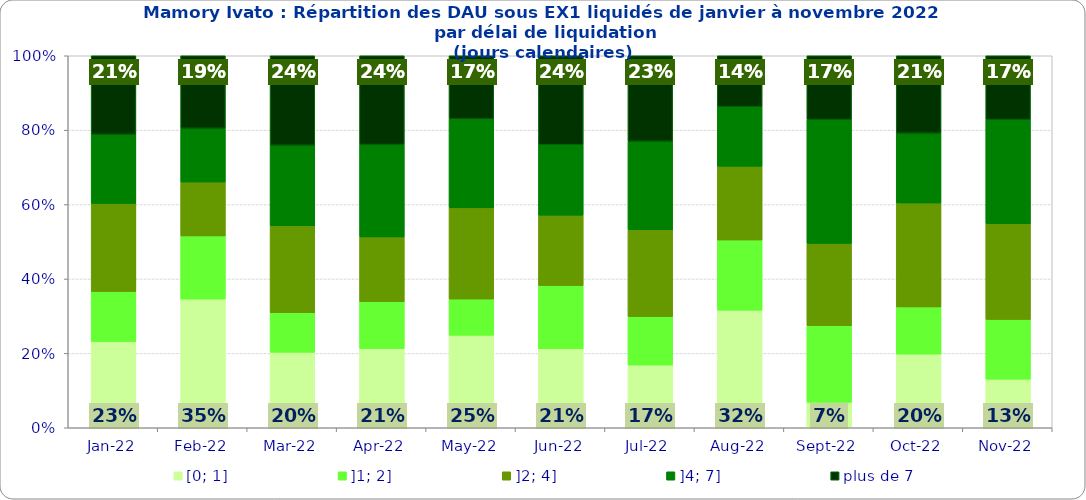
| Category | [0; 1] | ]1; 2] | ]2; 4] | ]4; 7] | plus de 7 |
|---|---|---|---|---|---|
| 2022-01-01 | 0.232 | 0.134 | 0.237 | 0.186 | 0.211 |
| 2022-02-01 | 0.346 | 0.17 | 0.145 | 0.145 | 0.195 |
| 2022-03-01 | 0.203 | 0.107 | 0.234 | 0.216 | 0.241 |
| 2022-04-01 | 0.213 | 0.126 | 0.174 | 0.248 | 0.239 |
| 2022-05-01 | 0.248 | 0.097 | 0.245 | 0.239 | 0.17 |
| 2022-06-01 | 0.213 | 0.169 | 0.189 | 0.189 | 0.239 |
| 2022-07-01 | 0.169 | 0.13 | 0.234 | 0.238 | 0.23 |
| 2022-08-01 | 0.316 | 0.189 | 0.198 | 0.16 | 0.137 |
| 2022-09-01 | 0.069 | 0.206 | 0.221 | 0.333 | 0.172 |
| 2022-10-01 | 0.198 | 0.127 | 0.279 | 0.188 | 0.208 |
| 2022-11-01 | 0.131 | 0.16 | 0.257 | 0.28 | 0.172 |